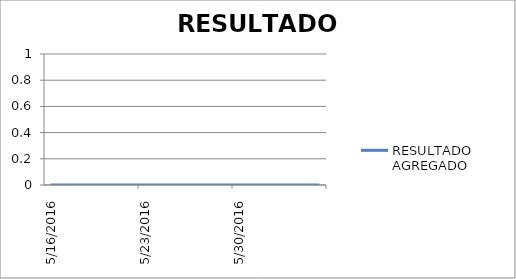
| Category | RESULTADO AGREGADO |
|---|---|
| 5/16/16 | 0 |
| 5/17/16 | 0 |
| 5/18/16 | 0 |
| 5/19/16 | 0 |
| 5/20/16 | 0 |
| 5/21/16 | 0 |
| 5/22/16 | 0 |
| 5/23/16 | 0 |
| 5/24/16 | 0 |
| 5/25/16 | 0 |
| 5/26/16 | 0 |
| 5/27/16 | 0 |
| 5/28/16 | 0 |
| 5/29/16 | 0 |
| 5/30/16 | 0 |
| 5/31/16 | 0 |
| 6/1/16 | 0 |
| 6/2/16 | 0 |
| 6/3/16 | 0 |
| 6/4/16 | 0 |
| 6/5/16 | 0 |